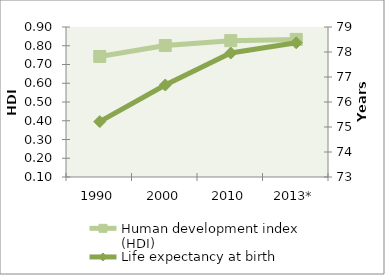
| Category | Human development index (HDI) |
|---|---|
| 1990 | 0.743 |
| 2000 | 0.801 |
| 2010 | 0.827 |
| 2013* | 0.834 |